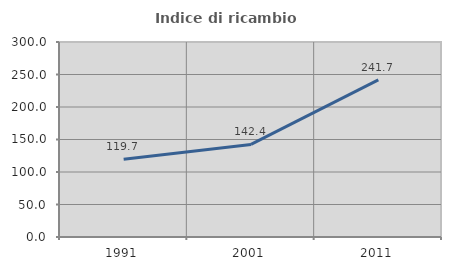
| Category | Indice di ricambio occupazionale  |
|---|---|
| 1991.0 | 119.672 |
| 2001.0 | 142.373 |
| 2011.0 | 241.667 |